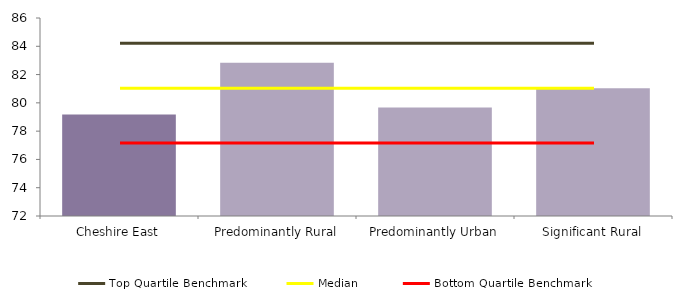
| Category | Series 0 |
|---|---|
| Cheshire East | 79.173 |
| Predominantly Rural | 82.833 |
| Predominantly Urban | 79.666 |
| Significant Rural | 81.028 |